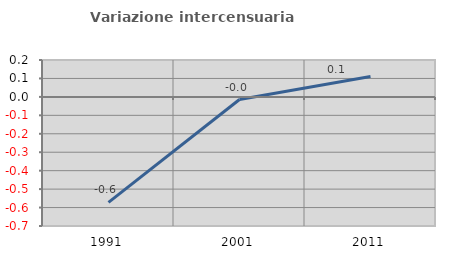
| Category | Variazione intercensuaria annua |
|---|---|
| 1991.0 | -0.572 |
| 2001.0 | -0.014 |
| 2011.0 | 0.11 |